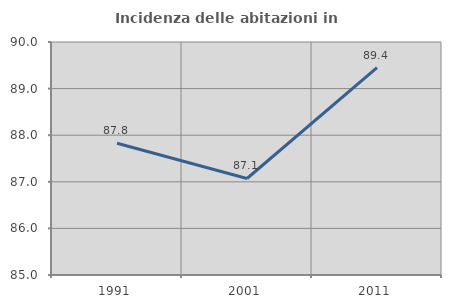
| Category | Incidenza delle abitazioni in proprietà  |
|---|---|
| 1991.0 | 87.826 |
| 2001.0 | 87.071 |
| 2011.0 | 89.448 |